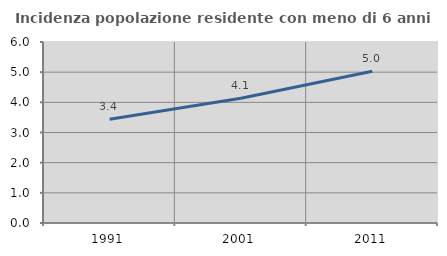
| Category | Incidenza popolazione residente con meno di 6 anni |
|---|---|
| 1991.0 | 3.439 |
| 2001.0 | 4.137 |
| 2011.0 | 5.027 |